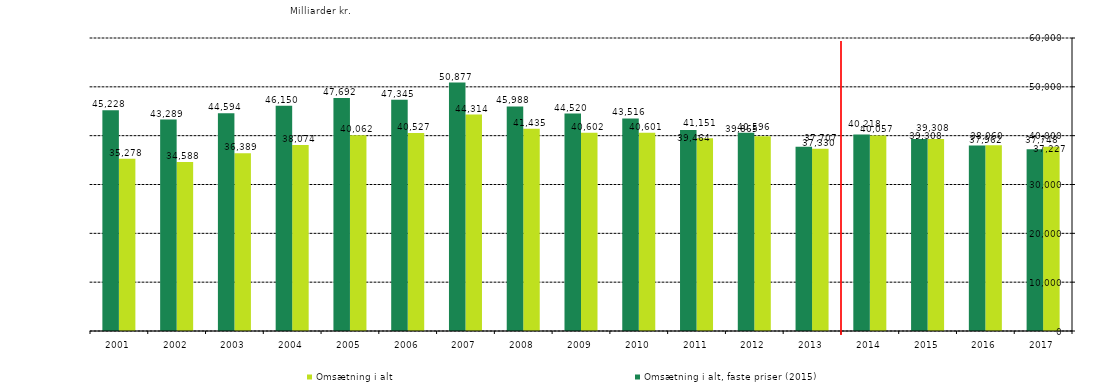
| Category | Omsætning i alt | Omsætning i alt, faste priser (2015) |
|---|---|---|
| 2017.0 | 37748.029 | 37226.853 |
| 2016.0 | 38060.451 | 37962.058 |
| 2015.0 | 39307.582 | 39307.582 |
| 2014.0 | 40056.669 | 40217.539 |
| 2013.0 | 37330.068 | 37707.139 |
| 2012.0 | 39864.928 | 40595.65 |
| 2011.0 | 39464.007 | 41151.206 |
| 2010.0 | 40600.517 | 43516.095 |
| 2009.0 | 40601.91 | 44519.638 |
| 2008.0 | 41434.892 | 45987.672 |
| 2007.0 | 44313.991 | 50877.142 |
| 2006.0 | 40527.202 | 47344.862 |
| 2005.0 | 40061.522 | 47692.288 |
| 2004.0 | 38073.875 | 46150.151 |
| 2003.0 | 36389.021 | 44594.388 |
| 2002.0 | 34587.914 | 43289.004 |
| 2001.0 | 35277.741 | 45227.873 |